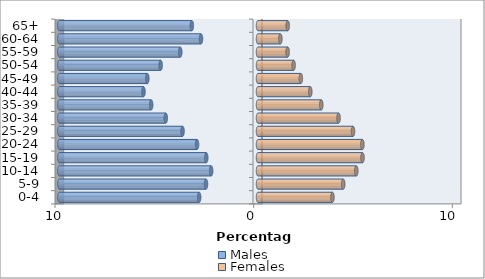
| Category | Males | Females |
|---|---|---|
| 0-4 | -2.962 | 3.747 |
| 5-9 | -2.617 | 4.29 |
| 10-14 | -2.359 | 4.949 |
| 15-19 | -2.605 | 5.261 |
| 20-24 | -3.068 | 5.254 |
| 25-29 | -3.799 | 4.783 |
| 30-34 | -4.643 | 4.055 |
| 35-39 | -5.378 | 3.185 |
| 40-44 | -5.765 | 2.632 |
| 45-49 | -5.571 | 2.157 |
| 50-54 | -4.901 | 1.792 |
| 55-59 | -3.913 | 1.491 |
| 60-64 | -2.87 | 1.127 |
| 65+ | -3.331 | 1.495 |